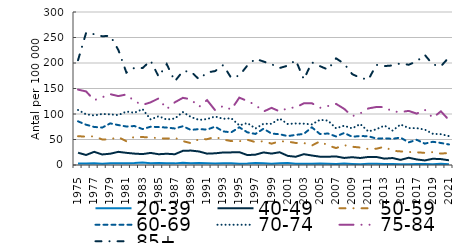
| Category | 20-39 | 40-49 | 50-59 | 60-69 | 70-74 | 75-84 | 85+ |
|---|---|---|---|---|---|---|---|
| 1975.0 | 2.845 | 24.057 | 56.479 | 85.598 | 107.935 | 147.8 | 205.526 |
| 1976.0 | 2.814 | 19.65 | 55.548 | 79.019 | 99.374 | 144.232 | 259.213 |
| 1977.0 | 3.218 | 25.806 | 56.358 | 74.633 | 97.117 | 127.12 | 256.503 |
| 1978.0 | 2.411 | 20.671 | 50.043 | 73.337 | 100.071 | 132.831 | 252.375 |
| 1979.0 | 3.252 | 22.154 | 50.433 | 81.594 | 99.209 | 138.841 | 253.433 |
| 1980.0 | 3.321 | 25.808 | 54.671 | 78.288 | 97.879 | 135.117 | 225.462 |
| 1981.0 | 3.563 | 23.846 | 46.517 | 75.463 | 104.807 | 138.311 | 181.133 |
| 1982.0 | 3.733 | 22.319 | 55.651 | 76.413 | 102.375 | 125.163 | 190.523 |
| 1983.0 | 5.108 | 21.382 | 54.774 | 70.481 | 109.608 | 117.914 | 190.077 |
| 1984.0 | 3.334 | 23.698 | 54.067 | 75.013 | 89.391 | 122.8 | 204.524 |
| 1985.0 | 3.944 | 21.117 | 52.493 | 74.389 | 95.657 | 130.658 | 173.208 |
| 1986.0 | 3.527 | 22.074 | 51.719 | 73.422 | 89.098 | 109.642 | 197.865 |
| 1987.0 | 3.19 | 21.065 | 53.331 | 71.628 | 91.097 | 122.871 | 164.106 |
| 1988.0 | 4.319 | 27.72 | 46.918 | 75.951 | 103.772 | 131.685 | 183.963 |
| 1989.0 | 3.46 | 28.291 | 42.783 | 68.759 | 94.138 | 128.795 | 183.151 |
| 1990.0 | 3.713 | 26.53 | 50.658 | 70.363 | 88.365 | 113.992 | 168.064 |
| 1991.0 | 3.442 | 22.269 | 50.659 | 69.439 | 90.037 | 127.222 | 181.388 |
| 1992.0 | 2.916 | 22.915 | 54.965 | 75.136 | 95.248 | 107.461 | 184.141 |
| 1993.0 | 3.332 | 24.54 | 49.913 | 65.841 | 90.503 | 115.814 | 195.904 |
| 1994.0 | 3.395 | 24.745 | 46.908 | 64.097 | 91.694 | 108.723 | 170.708 |
| 1995.0 | 2.537 | 25.226 | 46.528 | 73.964 | 77.743 | 132.091 | 175.376 |
| 1996.0 | 2.97 | 19.487 | 49.424 | 64.054 | 82.212 | 125.403 | 195.042 |
| 1997.0 | 3.756 | 20.275 | 44.89 | 60.922 | 71.591 | 117.824 | 208.248 |
| 1998.0 | 3.433 | 24.643 | 46.732 | 71.098 | 80.749 | 104.753 | 202.861 |
| 1999.0 | 2.498 | 22.373 | 41.778 | 61.655 | 80.721 | 112.09 | 197.601 |
| 2000.0 | 3.277 | 24.978 | 46.532 | 60.287 | 91.094 | 104.993 | 190.13 |
| 2001.0 | 3.708 | 17.912 | 45.976 | 56.667 | 80.478 | 111.432 | 194.776 |
| 2002.0 | 2.244 | 16.151 | 43.194 | 59.008 | 81.353 | 113.082 | 205.54 |
| 2003.0 | 2.684 | 21.26 | 43.214 | 61.058 | 81.024 | 120.912 | 167.908 |
| 2004.0 | 2.352 | 18.616 | 38.201 | 73.877 | 79.665 | 121.092 | 201.202 |
| 2005.0 | 2.805 | 16.304 | 46.299 | 60.776 | 88.677 | 112.149 | 193.848 |
| 2006.0 | 2.373 | 16.222 | 38.358 | 61.733 | 86.978 | 115.695 | 187.047 |
| 2007.0 | 1.842 | 16.795 | 33.221 | 55.967 | 71.971 | 119.823 | 209.058 |
| 2008.0 | 2.702 | 13.839 | 38.908 | 62.822 | 77.044 | 110.15 | 198.72 |
| 2009.0 | 2.152 | 15.29 | 35.821 | 55.419 | 71.812 | 95.74 | 178.178 |
| 2010.0 | 1.696 | 13.737 | 34.272 | 56.801 | 80.368 | 101.15 | 170.841 |
| 2011.0 | 2.595 | 15.788 | 31.338 | 56.387 | 65.773 | 110.951 | 167.28 |
| 2012.0 | 2.483 | 15.79 | 31.931 | 51.854 | 70.111 | 113.729 | 196.345 |
| 2013.0 | 1.964 | 12.461 | 35.679 | 52.345 | 77.358 | 113.474 | 193.945 |
| 2014.0 | 1.782 | 13.675 | 27.861 | 51.372 | 67.422 | 104.923 | 195.179 |
| 2015.0 | 1.284 | 10.021 | 26.673 | 53.67 | 79.549 | 103.878 | 199.34 |
| 2016.0 | 1.667 | 14.261 | 25.54 | 44.353 | 72.387 | 106.082 | 196.542 |
| 2017.0 | 2.117 | 10.921 | 24.942 | 49.386 | 72.203 | 100.724 | 203.26 |
| 2018.0 | 2.018 | 8.938 | 23.784 | 41.904 | 69.535 | 108.329 | 215.922 |
| 2019.0 | 1.617 | 12.237 | 25.25 | 45.494 | 61.196 | 92.499 | 196.989 |
| 2020.0 | 2.228 | 11.584 | 22.379 | 43.174 | 60.414 | 105.253 | 193.641 |
| 2021.0 | 1.61 | 9.238 | 23.518 | 40.288 | 56.665 | 88.114 | 211.126 |